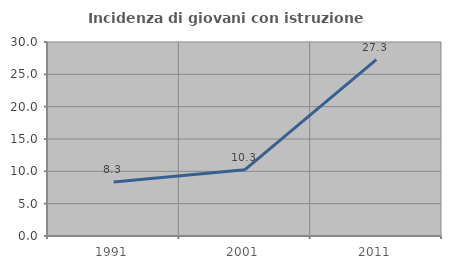
| Category | Incidenza di giovani con istruzione universitaria |
|---|---|
| 1991.0 | 8.333 |
| 2001.0 | 10.256 |
| 2011.0 | 27.273 |